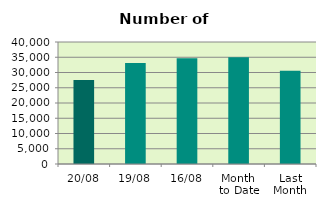
| Category | Series 0 |
|---|---|
| 20/08 | 27506 |
| 19/08 | 33116 |
| 16/08 | 34632 |
| Month 
to Date | 34991.571 |
| Last
Month | 30613.13 |